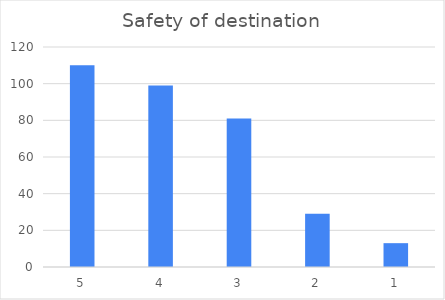
| Category | Series 0 |
|---|---|
| 5 | 110 |
| 4 | 99 |
| 3 | 81 |
| 2 | 29 |
| 1 | 13 |